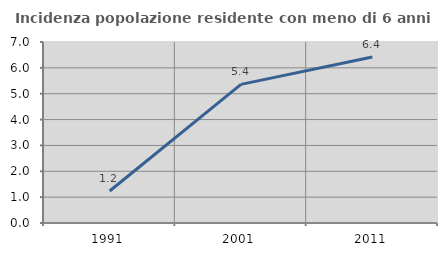
| Category | Incidenza popolazione residente con meno di 6 anni |
|---|---|
| 1991.0 | 1.238 |
| 2001.0 | 5.362 |
| 2011.0 | 6.417 |